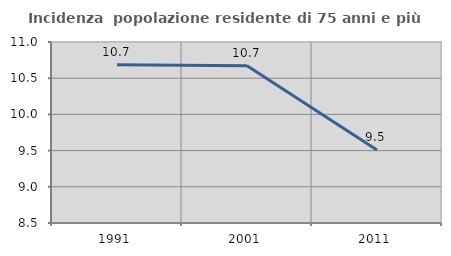
| Category | Incidenza  popolazione residente di 75 anni e più |
|---|---|
| 1991.0 | 10.687 |
| 2001.0 | 10.672 |
| 2011.0 | 9.507 |